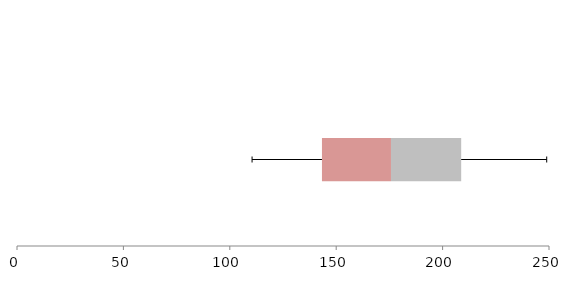
| Category | Series 1 | Series 2 | Series 3 |
|---|---|---|---|
| 0 | 143.306 | 32.436 | 32.99 |